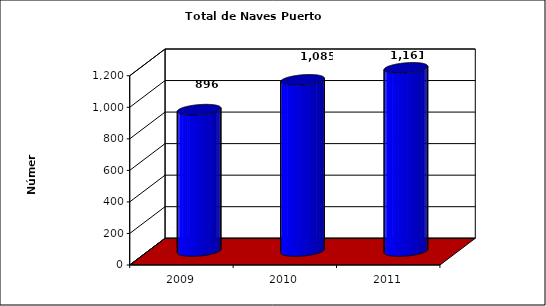
| Category | Series 0 |
|---|---|
| 2009.0 | 896 |
| 2010.0 | 1085 |
| 2011.0 | 1161 |